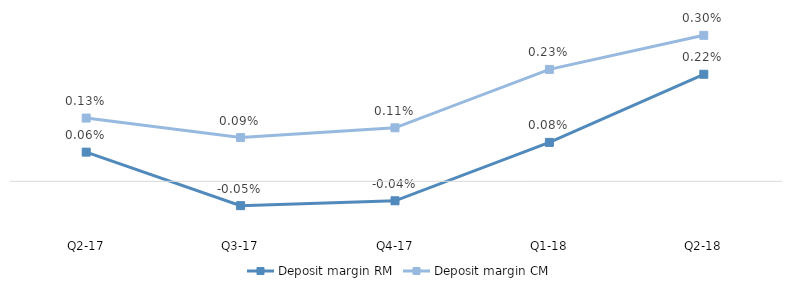
| Category | Deposit margin RM | Deposit margin CM |
|---|---|---|
| Q2-18 | 0.002 | 0.003 |
| Q1-18 | 0.001 | 0.002 |
| Q4-17 | 0 | 0.001 |
| Q3-17 | 0 | 0.001 |
| Q2-17 | 0.001 | 0.001 |